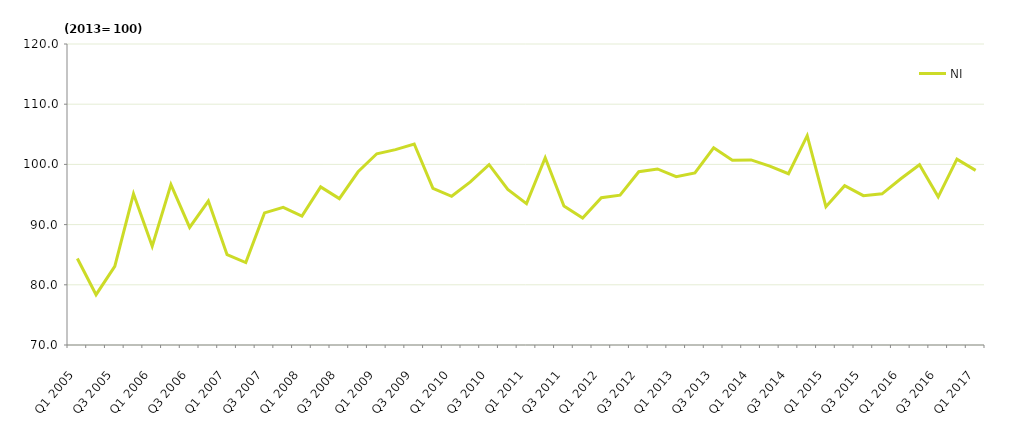
| Category | NI |
|---|---|
| Q1 2005 | 84.371 |
| Q2 2005 | 78.359 |
| Q3 2005 | 83.058 |
| Q4 2005 | 95.107 |
| Q1 2006 | 86.417 |
| Q2 2006 | 96.631 |
| Q3 2006 | 89.525 |
| Q4 2006 | 93.903 |
| Q1 2007 | 84.997 |
| Q2 2007 | 83.686 |
| Q3 2007 | 91.941 |
| Q4 2007 | 92.862 |
| Q1 2008 | 91.429 |
| Q2 2008 | 96.269 |
| Q3 2008 | 94.315 |
| Q4 2008 | 98.773 |
| Q1 2009 | 101.764 |
| Q2 2009 | 102.456 |
| Q3 2009 | 103.396 |
| Q4 2009 | 96.037 |
| Q1 2010 | 94.705 |
| Q2 2010 | 97.093 |
| Q3 2010 | 99.964 |
| Q4 2010 | 95.835 |
| Q1 2011 | 93.476 |
| Q2 2011 | 101.112 |
| Q3 2011 | 93.087 |
| Q4 2011 | 91.087 |
| Q1 2012 | 94.458 |
| Q2 2012 | 94.883 |
| Q3 2012 | 98.777 |
| Q4 2012 | 99.245 |
| Q1 2013 | 97.971 |
| Q2 2013 | 98.586 |
| Q3 2013 | 102.762 |
| Q4 2013 | 100.681 |
| Q1 2014 | 100.751 |
| Q2 2014 | 99.709 |
| Q3 2014 | 98.452 |
| Q4 2014 | 104.768 |
| Q1 2015 | 92.977 |
| Q2 2015 | 96.469 |
| Q3 2015 | 94.807 |
| Q4 2015 | 95.106 |
| Q1 2016 | 97.612 |
| Q2 2016 | 99.939 |
| Q3 2016 | 94.618 |
| Q4 2016 | 100.875 |
| Q1 2017 | 99.004 |